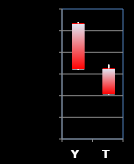
| Category | Series 0 | Series 1 | Series 2 | Series 3 |
|---|---|---|---|---|
| Y | 1123.3 | 1123.9 | 1101.9 | 1102.2 |
| T | 1102.5 | 1104.3 | 1090.6 | 1090.7 |